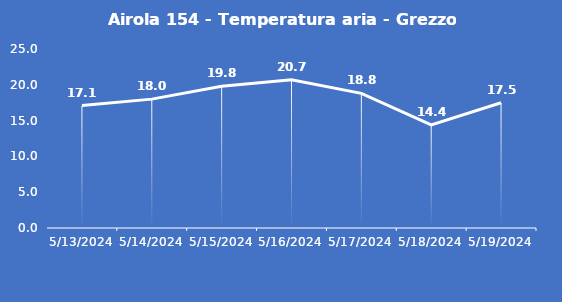
| Category | Airola 154 - Temperatura aria - Grezzo (°C) |
|---|---|
| 5/13/24 | 17.1 |
| 5/14/24 | 18 |
| 5/15/24 | 19.8 |
| 5/16/24 | 20.7 |
| 5/17/24 | 18.8 |
| 5/18/24 | 14.4 |
| 5/19/24 | 17.5 |